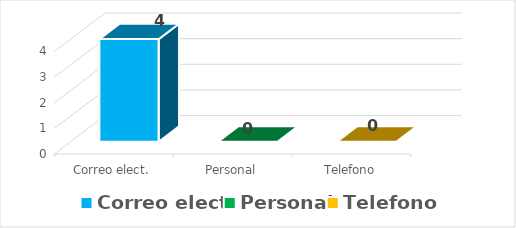
| Category | Series 0 |
|---|---|
| Correo elect. | 4 |
| Personal | 0 |
| Telefono | 0 |